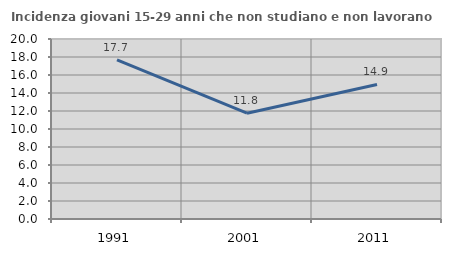
| Category | Incidenza giovani 15-29 anni che non studiano e non lavorano  |
|---|---|
| 1991.0 | 17.675 |
| 2001.0 | 11.753 |
| 2011.0 | 14.945 |